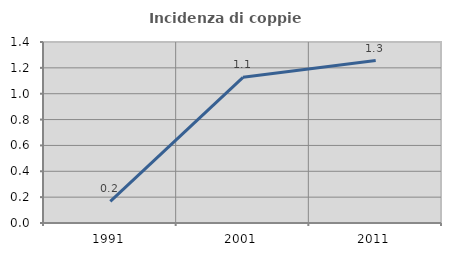
| Category | Incidenza di coppie miste |
|---|---|
| 1991.0 | 0.168 |
| 2001.0 | 1.127 |
| 2011.0 | 1.256 |